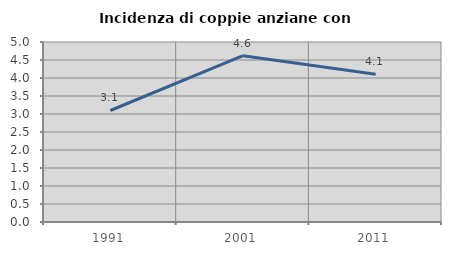
| Category | Incidenza di coppie anziane con figli |
|---|---|
| 1991.0 | 3.097 |
| 2001.0 | 4.619 |
| 2011.0 | 4.103 |